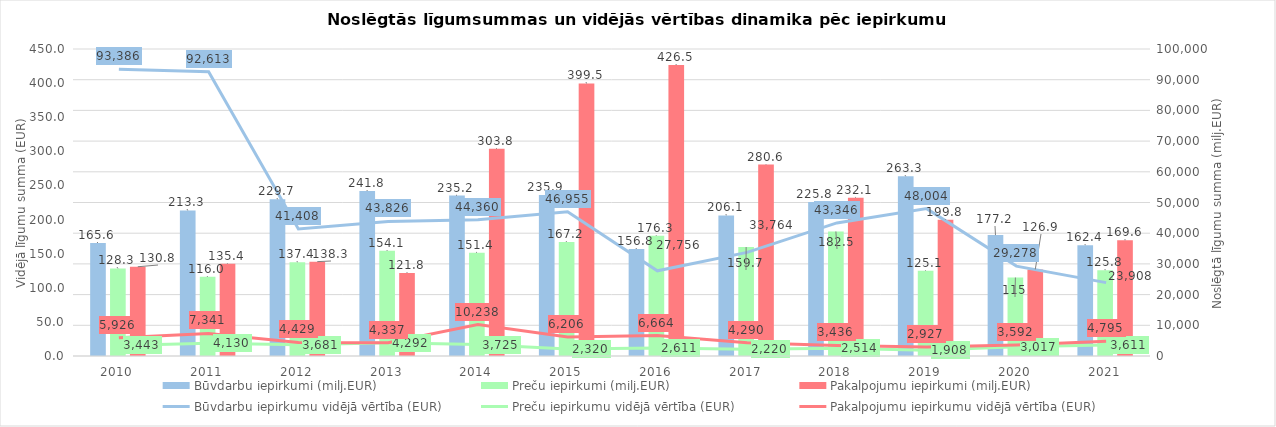
| Category | Būvdarbu iepirkumi (milj.EUR) | Preču iepirkumi (milj.EUR) | Pakalpojumu iepirkumi (milj.EUR) |
|---|---|---|---|
| 2010.0 | 165.6 | 128.3 | 130.8 |
| 2011.0 | 213.3 | 116 | 135.4 |
| 2012.0 | 229.7 | 137.4 | 138.3 |
| 2013.0 | 241.8 | 154.1 | 121.8 |
| 2014.0 | 235.2 | 151.4 | 303.8 |
| 2015.0 | 235.9 | 167.2 | 399.5 |
| 2016.0 | 156.8 | 176.3 | 426.5 |
| 2017.0 | 206.1 | 159.7 | 280.6 |
| 2018.0 | 225.8 | 182.5 | 232.1 |
| 2019.0 | 263.3 | 125.1 | 199.8 |
| 2020.0 | 177.2 | 115 | 126.9 |
| 2021.0 | 162.4 | 125.8 | 169.6 |